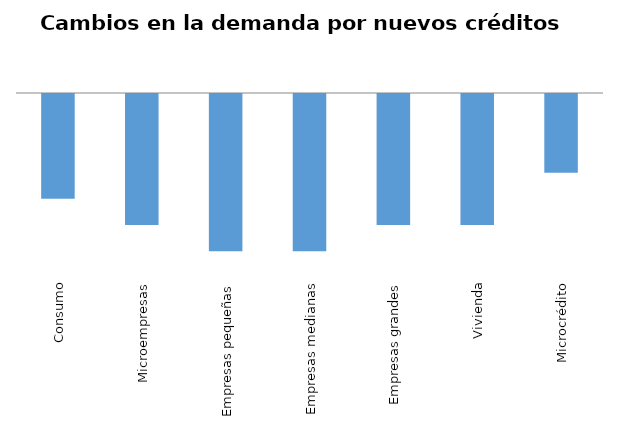
| Category | Series 0 |
|---|---|
| Consumo | -0.364 |
| Microempresas | -0.455 |
| Empresas pequeñas | -0.545 |
| Empresas medianas | -0.545 |
| Empresas grandes | -0.455 |
| Vivienda | -0.455 |
| Microcrédito | -0.273 |